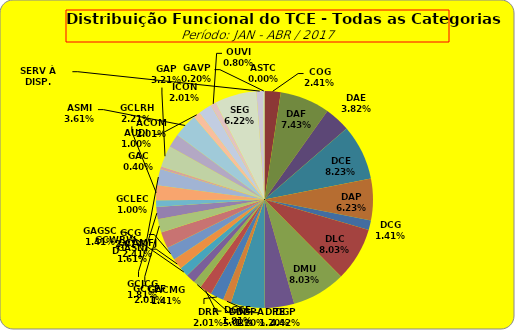
| Category | ASTC |
|---|---|
| ASTC | 0 |
| COG | 12 |
| DAF | 37 |
| DAE | 19 |
| DCE | 41 |
| DAP | 31 |
| DCG | 7 |
| DLC | 40 |
| DMU | 40 |
| DGP | 22 |
| DIN | 25 |
| DPE | 6 |
| DRR | 10 |
| DGCE | 9 |
| DGPA | 6 |
| GACMG | 7 |
| GAGSC | 7 |
| GASNI | 8 |
| GCG | 10 |
| GCAMFJ | 12 |
| GCCFF | 10 |
| GCJCG | 9 |
| GCLEC | 5 |
| GCLRH | 11 |
| GCWRWD | 12 |
| GAC | 2 |
| GAP | 16 |
| ACOM | 10 |
| ASMI | 18 |
| AUDI | 5 |
| ICON | 10 |
| OUVI | 4 |
| SEG | 31 |
| SERV À DISP. | 5 |
| GAVP | 1 |